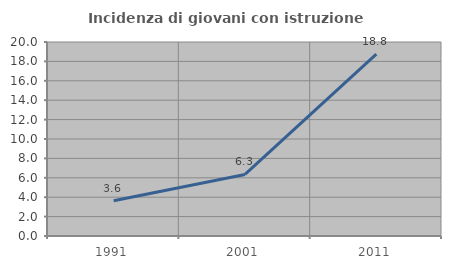
| Category | Incidenza di giovani con istruzione universitaria |
|---|---|
| 1991.0 | 3.636 |
| 2001.0 | 6.349 |
| 2011.0 | 18.75 |